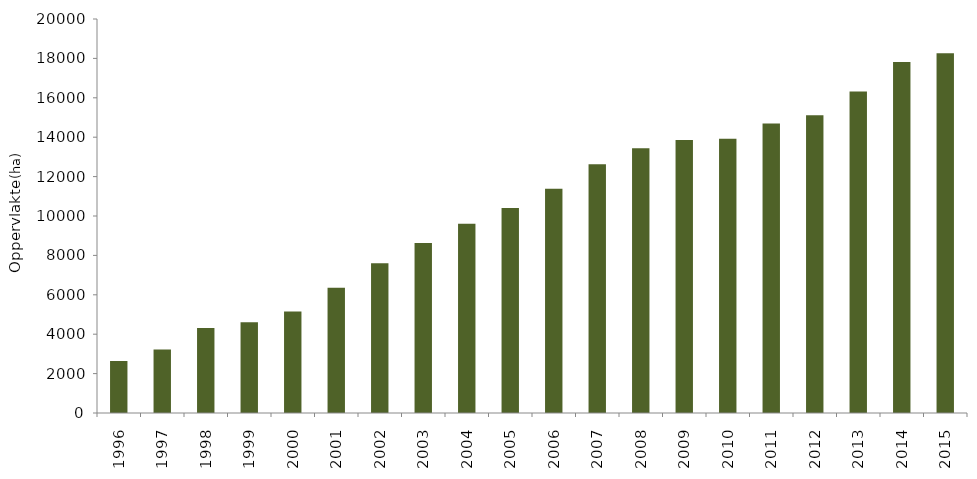
| Category | oppervlakte erkend natuurreservaat (ha) |
|---|---|
| 1996.0 | 2641 |
| 1997.0 | 3229 |
| 1998.0 | 4318 |
| 1999.0 | 4612 |
| 2000.0 | 5151 |
| 2001.0 | 6364 |
| 2002.0 | 7604 |
| 2003.0 | 8624 |
| 2004.0 | 9611 |
| 2005.0 | 10408.28 |
| 2006.0 | 11378 |
| 2007.0 | 12625.54 |
| 2008.0 | 13434.859 |
| 2009.0 | 13862 |
| 2010.0 | 13921 |
| 2011.0 | 14695 |
| 2012.0 | 15119 |
| 2013.0 | 16318 |
| 2014.0 | 17817 |
| 2015.0 | 18263 |